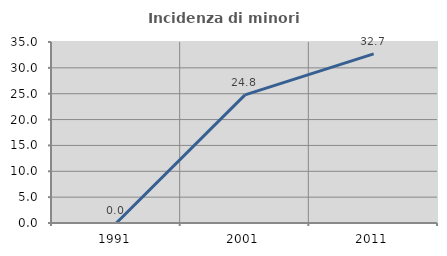
| Category | Incidenza di minori stranieri |
|---|---|
| 1991.0 | 0 |
| 2001.0 | 24.775 |
| 2011.0 | 32.7 |